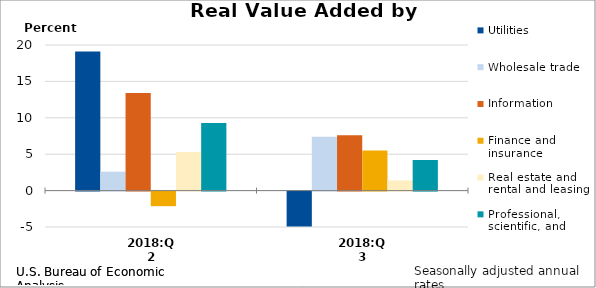
| Category | Utilities | Wholesale trade | Information | Finance and insurance | Real estate and rental and leasing | Professional, scientific, and technical services |
|---|---|---|---|---|---|---|
| 2018:Q2 | 19.1 | 2.6 | 13.4 | -2 | 5.3 | 9.3 |
| 2018:Q3 | -4.8 | 7.4 | 7.6 | 5.5 | 1.4 | 4.2 |